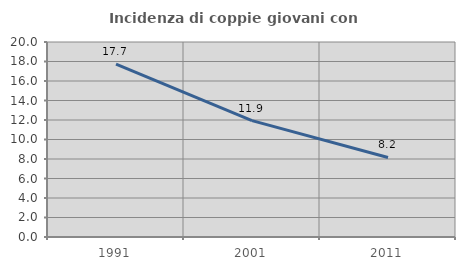
| Category | Incidenza di coppie giovani con figli |
|---|---|
| 1991.0 | 17.73 |
| 2001.0 | 11.939 |
| 2011.0 | 8.156 |